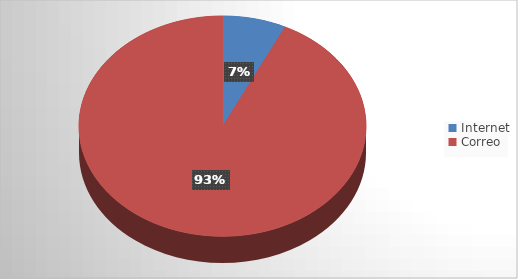
| Category | Series 0 |
|---|---|
| Internet | 5 |
| Correo | 65 |